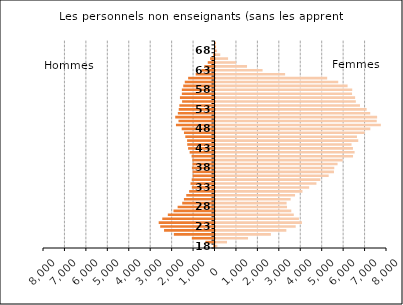
| Category | Series 2 |
|---|---|
| 18.0 | 90 |
| 19.0 | 537 |
| 20.0 | 1517 |
| 21.0 | 2583 |
| 22.0 | 3304 |
| 23.0 | 3741 |
| 24.0 | 4032 |
| 25.0 | 3892 |
| 26.0 | 3652 |
| 27.0 | 3535 |
| 28.0 | 3336 |
| 29.0 | 3316 |
| 30.0 | 3505 |
| 31.0 | 3711 |
| 32.0 | 4056 |
| 33.0 | 4369 |
| 34.0 | 4708 |
| 35.0 | 4892 |
| 36.0 | 5279 |
| 37.0 | 5526 |
| 38.0 | 5541 |
| 39.0 | 5694 |
| 40.0 | 5936 |
| 41.0 | 6415 |
| 42.0 | 6488 |
| 43.0 | 6411 |
| 44.0 | 6346 |
| 45.0 | 6659 |
| 46.0 | 6599 |
| 47.0 | 6960 |
| 48.0 | 7222 |
| 49.0 | 7713 |
| 50.0 | 7521 |
| 51.0 | 7539 |
| 52.0 | 7218 |
| 53.0 | 7050 |
| 54.0 | 6739 |
| 55.0 | 6546 |
| 56.0 | 6512 |
| 57.0 | 6370 |
| 58.0 | 6378 |
| 59.0 | 6162 |
| 60.0 | 5725 |
| 61.0 | 5209 |
| 62.0 | 3247 |
| 63.0 | 2196 |
| 64.0 | 1470 |
| 65.0 | 961 |
| 66.0 | 586 |
| 67.0 | 222 |
| 68.0 | 73 |
| 69.0 | 27 |
| 70.0 | 15 |